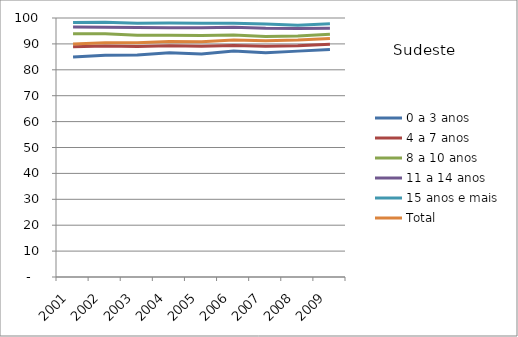
| Category | 0 a 3 anos | 4 a 7 anos | 8 a 10 anos | 11 a 14 anos | 15 anos e mais | Total |
|---|---|---|---|---|---|---|
| 2001.0 | 84.93 | 88.86 | 93.9 | 96.54 | 98.23 | 89.99 |
| 2002.0 | 85.62 | 89.19 | 93.95 | 96.47 | 98.37 | 90.48 |
| 2003.0 | 85.69 | 88.98 | 93.38 | 96.33 | 98.02 | 90.49 |
| 2004.0 | 86.54 | 89.25 | 93.38 | 96.28 | 98.06 | 90.95 |
| 2005.0 | 86.06 | 89.14 | 93.26 | 96.24 | 98.01 | 90.86 |
| 2006.0 | 87.3 | 89.41 | 93.39 | 96.45 | 97.98 | 91.54 |
| 2007.0 | 86.58 | 89.13 | 92.83 | 96.06 | 97.71 | 91.19 |
| 2008.0 | 87.21 | 89.29 | 93.09 | 95.96 | 97.21 | 91.5 |
| 2009.0 | 87.86 | 89.89 | 93.7 | 96.06 | 97.82 | 92.09 |